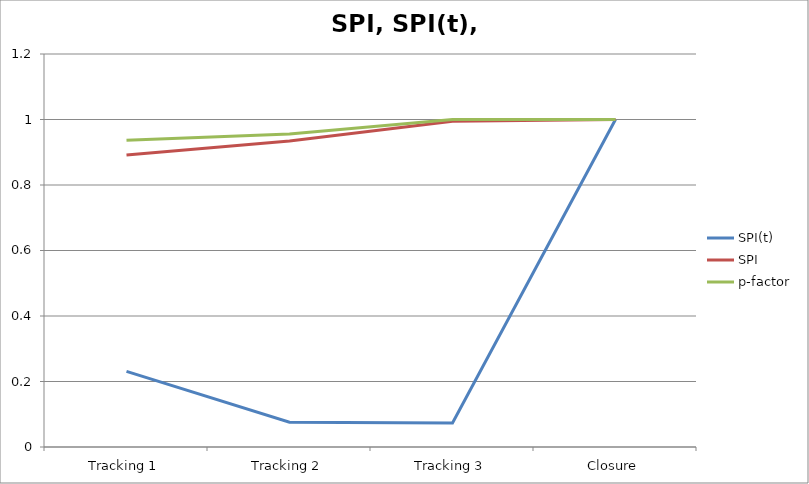
| Category | SPI(t) | SPI | p-factor |
|---|---|---|---|
| Tracking 1 | 0.231 | 0.892 | 0.937 |
| Tracking 2 | 0.076 | 0.935 | 0.955 |
| Tracking 3 | 0.073 | 0.994 | 1 |
| Closure | 1 | 1 | 1 |